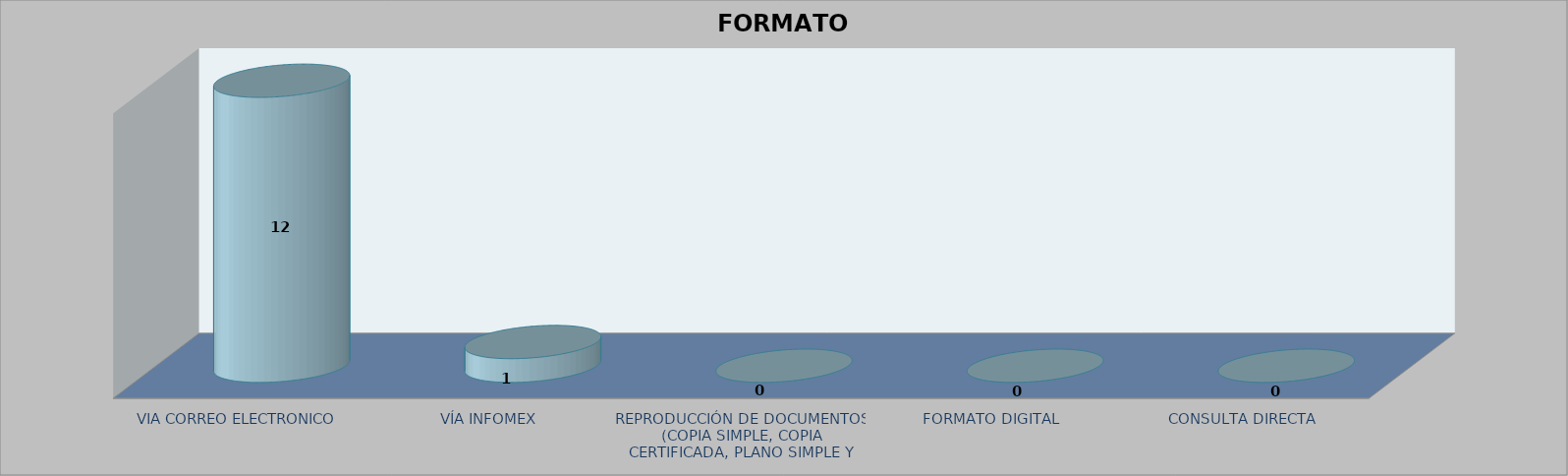
| Category |        FORMATO SOLICITADO | Series 1 | Series 2 |
|---|---|---|---|
| VIA CORREO ELECTRONICO |  |  | 12 |
| VÍA INFOMEX |  |  | 1 |
| REPRODUCCIÓN DE DOCUMENTOS (COPIA SIMPLE, COPIA CERTIFICADA, PLANO SIMPLE Y PLANO CERTIFICADO) |  |  | 0 |
| FORMATO DIGITAL |  |  | 0 |
| CONSULTA DIRECTA |  |  | 0 |